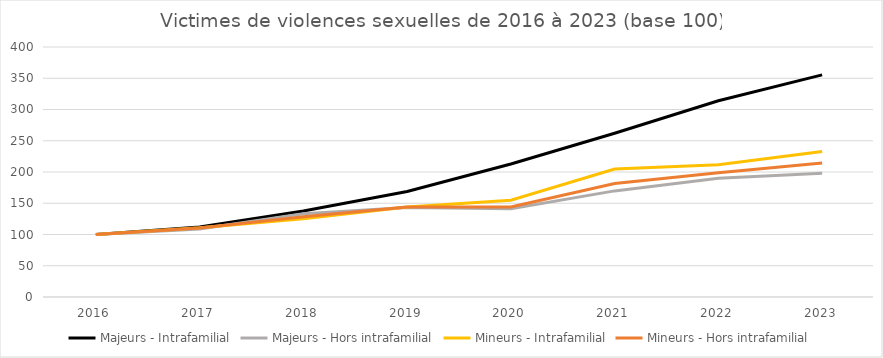
| Category | Majeurs - Intrafamilial | Majeurs - Hors intrafamilial | Mineurs - Intrafamilial | Mineurs - Hors intrafamilial |
|---|---|---|---|---|
| 2016.0 | 100 | 100 | 100 | 100 |
| 2017.0 | 111.976 | 108.873 | 110.655 | 110.377 |
| 2018.0 | 137.643 | 133.054 | 125 | 128.321 |
| 2019.0 | 168.742 | 143.274 | 143.849 | 144.008 |
| 2020.0 | 212.897 | 141.059 | 154.814 | 144.074 |
| 2021.0 | 262.071 | 169.772 | 204.754 | 181.442 |
| 2022.0 | 313.945 | 190.175 | 211.789 | 198.717 |
| 2023.0 | 355.337 | 198.137 | 232.824 | 214.502 |